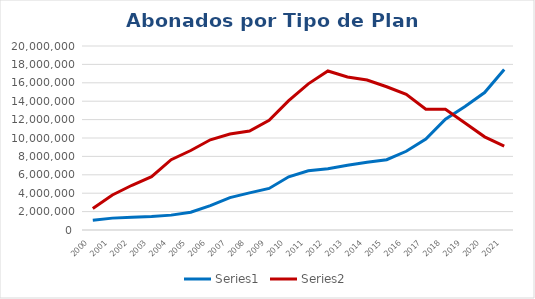
| Category | Series 2 | Series 3 |
|---|---|---|
| 2000.0 | 1068130 | 2333395 |
| 2001.0 | 1290852 | 3809931 |
| 2002.0 | 1382871 | 4861439 |
| 2003.0 | 1473310 | 5794971 |
| 2004.0 | 1616653 | 7644732 |
| 2005.0 | 1931459 | 8638113 |
| 2006.0 | 2644224 | 9806577 |
| 2007.0 | 3523166 | 10432036 |
| 2008.0 | 4033678 | 10762915 |
| 2009.0 | 4517200 | 11933023 |
| 2010.0 | 5786405 | 14065837 |
| 2011.0 | 6429681 | 15885567 |
| 2012.0 | 6657716 | 17283257 |
| 2013.0 | 7031350 | 16629989 |
| 2014.0 | 7375577 | 16305141 |
| 2015.0 | 7638385 | 15567968 |
| 2016.0 | 8556131 | 14746472 |
| 2017.0 | 9878035 | 13135112 |
| 2018.0 | 12051532 | 13127449 |
| 2019.0 | 13431953 | 11619715 |
| 2020.0 | 14943390 | 10124859 |
| 2021.0 | 17450637 | 9121186 |